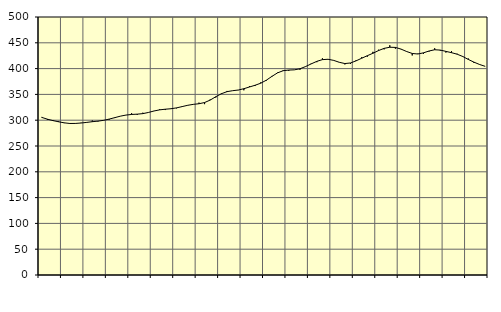
| Category | Piggar | Series 1 |
|---|---|---|
| nan | 306.3 | 305.4 |
| 1.0 | 300.5 | 301.99 |
| 1.0 | 300.4 | 299.18 |
| 1.0 | 298.2 | 296.88 |
| nan | 294.4 | 294.9 |
| 2.0 | 293 | 293.65 |
| 2.0 | 293.3 | 293.74 |
| 2.0 | 295 | 294.57 |
| nan | 295.3 | 295.75 |
| 3.0 | 299.3 | 297.11 |
| 3.0 | 297.4 | 298.19 |
| 3.0 | 299.4 | 299.73 |
| nan | 300.9 | 302.13 |
| 4.0 | 304.2 | 304.96 |
| 4.0 | 307.7 | 307.83 |
| 4.0 | 309.9 | 309.94 |
| nan | 313.5 | 311.13 |
| 5.0 | 310.3 | 311.72 |
| 5.0 | 314.5 | 312.72 |
| 5.0 | 315.2 | 315.01 |
| nan | 318 | 317.89 |
| 6.0 | 321.3 | 320.06 |
| 6.0 | 319.7 | 321.3 |
| 6.0 | 322.6 | 322.2 |
| nan | 323 | 323.87 |
| 7.0 | 326.8 | 326.35 |
| 7.0 | 329.3 | 328.91 |
| 7.0 | 330.4 | 330.71 |
| nan | 334 | 331.9 |
| 8.0 | 331.1 | 334.23 |
| 8.0 | 340.1 | 338.99 |
| 8.0 | 343.9 | 345.5 |
| nan | 352.2 | 351.3 |
| 9.0 | 356.7 | 355.33 |
| 9.0 | 357.3 | 357.17 |
| 9.0 | 358.2 | 358.48 |
| nan | 358 | 361.03 |
| 10.0 | 366 | 364.38 |
| 10.0 | 366.2 | 367.71 |
| 10.0 | 373.2 | 371.66 |
| nan | 376.5 | 377.5 |
| 11.0 | 385.8 | 384.92 |
| 11.0 | 392.4 | 391.72 |
| 11.0 | 396.8 | 395.91 |
| nan | 395.7 | 397.19 |
| 12.0 | 397.5 | 397.61 |
| 12.0 | 397.8 | 399.7 |
| 12.0 | 403.6 | 403.96 |
| nan | 409.9 | 409.13 |
| 13.0 | 412.4 | 414.06 |
| 13.0 | 419.9 | 417.37 |
| 13.0 | 418.3 | 418.06 |
| nan | 415.6 | 415.92 |
| 14.0 | 412.5 | 412.24 |
| 14.0 | 408.1 | 409.79 |
| 14.0 | 409 | 410.89 |
| nan | 416.4 | 415.04 |
| 15.0 | 422.2 | 420.09 |
| 15.0 | 423.1 | 425.02 |
| 15.0 | 432.5 | 429.72 |
| nan | 436.6 | 434.98 |
| 16.0 | 437.3 | 439.24 |
| 16.0 | 445.2 | 441.4 |
| 16.0 | 438.6 | 441.06 |
| nan | 438 | 437.8 |
| 17.0 | 432.7 | 433.13 |
| 17.0 | 425.5 | 429.34 |
| 17.0 | 429 | 428.28 |
| nan | 428.6 | 430.55 |
| 18.0 | 433.2 | 434.13 |
| 18.0 | 439.4 | 436.51 |
| 18.0 | 434.8 | 435.87 |
| nan | 431.1 | 433.38 |
| 19.0 | 433.8 | 430.86 |
| 19.0 | 428.8 | 427.93 |
| 19.0 | 424.2 | 423.47 |
| nan | 419.5 | 417.72 |
| 20.0 | 410.9 | 412.48 |
| 20.0 | 407.6 | 407.97 |
| 20.0 | 404.3 | 404.37 |